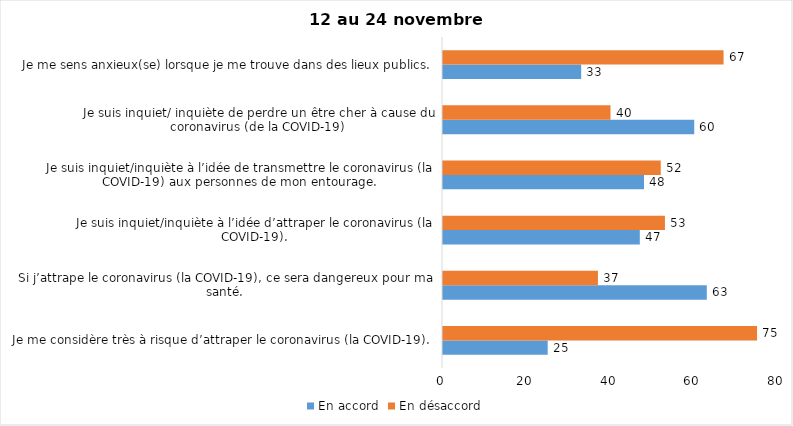
| Category | En accord | En désaccord |
|---|---|---|
| Je me considère très à risque d’attraper le coronavirus (la COVID-19). | 25 | 75 |
| Si j’attrape le coronavirus (la COVID-19), ce sera dangereux pour ma santé. | 63 | 37 |
| Je suis inquiet/inquiète à l’idée d’attraper le coronavirus (la COVID-19). | 47 | 53 |
| Je suis inquiet/inquiète à l’idée de transmettre le coronavirus (la COVID-19) aux personnes de mon entourage. | 48 | 52 |
| Je suis inquiet/ inquiète de perdre un être cher à cause du coronavirus (de la COVID-19) | 60 | 40 |
| Je me sens anxieux(se) lorsque je me trouve dans des lieux publics. | 33 | 67 |